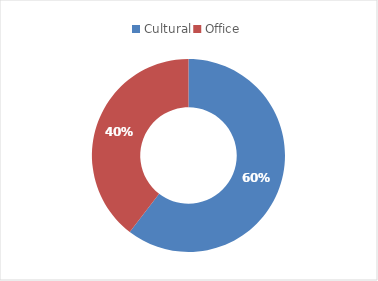
| Category | Series 0 |
|---|---|
| Cultural | 172229 |
| Office | 112838 |